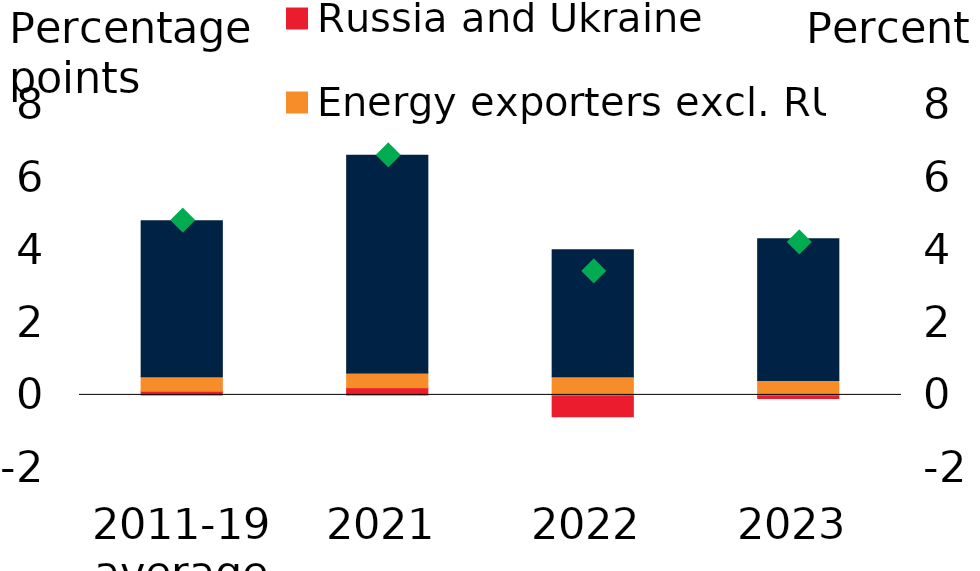
| Category | Russia and Ukraine | Energy exporters excl. RUS | Other EMDEs |
|---|---|---|---|
| 2011-19 average | 0.1 | 0.4 | 4.3 |
| 2021 | 0.2 | 0.4 | 6 |
| 2022 | -0.6 | 0.5 | 3.5 |
| 2023 | -0.1 | 0.4 | 3.9 |